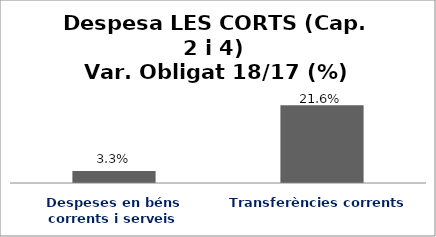
| Category | Series 0 |
|---|---|
| Despeses en béns corrents i serveis | 0.033 |
| Transferències corrents | 0.216 |